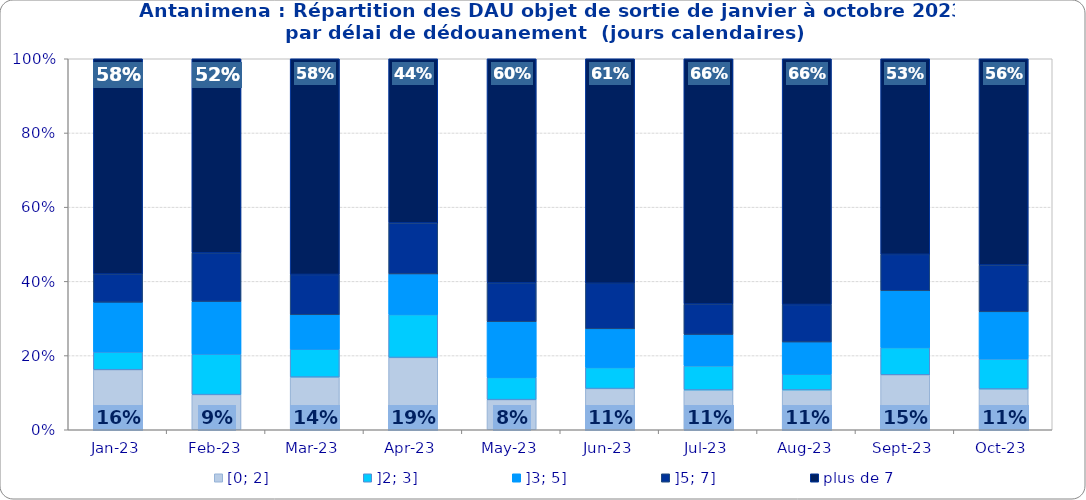
| Category | [0; 2] | ]2; 3] | ]3; 5] | ]5; 7] | plus de 7 |
|---|---|---|---|---|---|
| 2023-01-01 | 0.162 | 0.048 | 0.134 | 0.076 | 0.58 |
| 2023-02-01 | 0.095 | 0.109 | 0.142 | 0.131 | 0.523 |
| 2023-03-01 | 0.142 | 0.075 | 0.093 | 0.109 | 0.581 |
| 2023-04-01 | 0.195 | 0.116 | 0.109 | 0.137 | 0.442 |
| 2023-05-01 | 0.081 | 0.06 | 0.15 | 0.105 | 0.604 |
| 2023-06-01 | 0.111 | 0.057 | 0.104 | 0.123 | 0.605 |
| 2023-07-01 | 0.107 | 0.065 | 0.084 | 0.082 | 0.661 |
| 2023-08-01 | 0.107 | 0.042 | 0.087 | 0.101 | 0.662 |
| 2023-09-01 | 0.148 | 0.073 | 0.153 | 0.098 | 0.527 |
| 2023-10-01 | 0.11 | 0.081 | 0.127 | 0.126 | 0.556 |